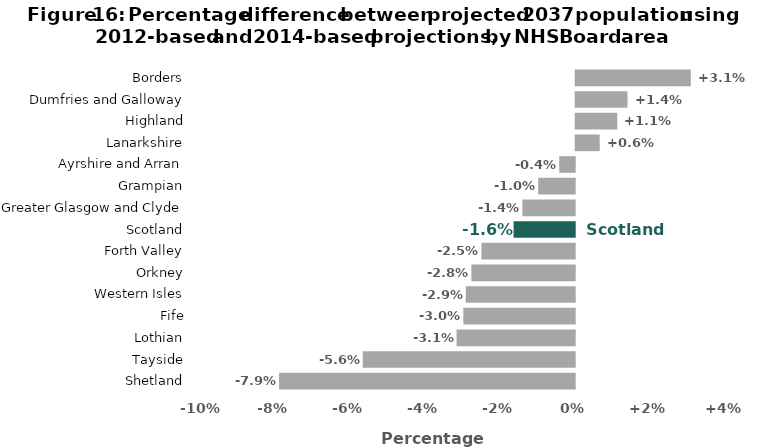
| Category | Series 0 |
|---|---|
| Shetland | -7.87 |
| Tayside | -5.641 |
| Lothian | -3.144 |
| Fife | -2.965 |
| Western Isles | -2.899 |
| Orkney | -2.75 |
| Forth Valley | -2.482 |
| Scotland | -1.628 |
| Greater Glasgow and Clyde | -1.393 |
| Grampian | -0.972 |
| Ayrshire and Arran | -0.413 |
| Lanarkshire | 0.638 |
| Highland | 1.106 |
| Dumfries and Galloway | 1.378 |
| Borders | 3.064 |